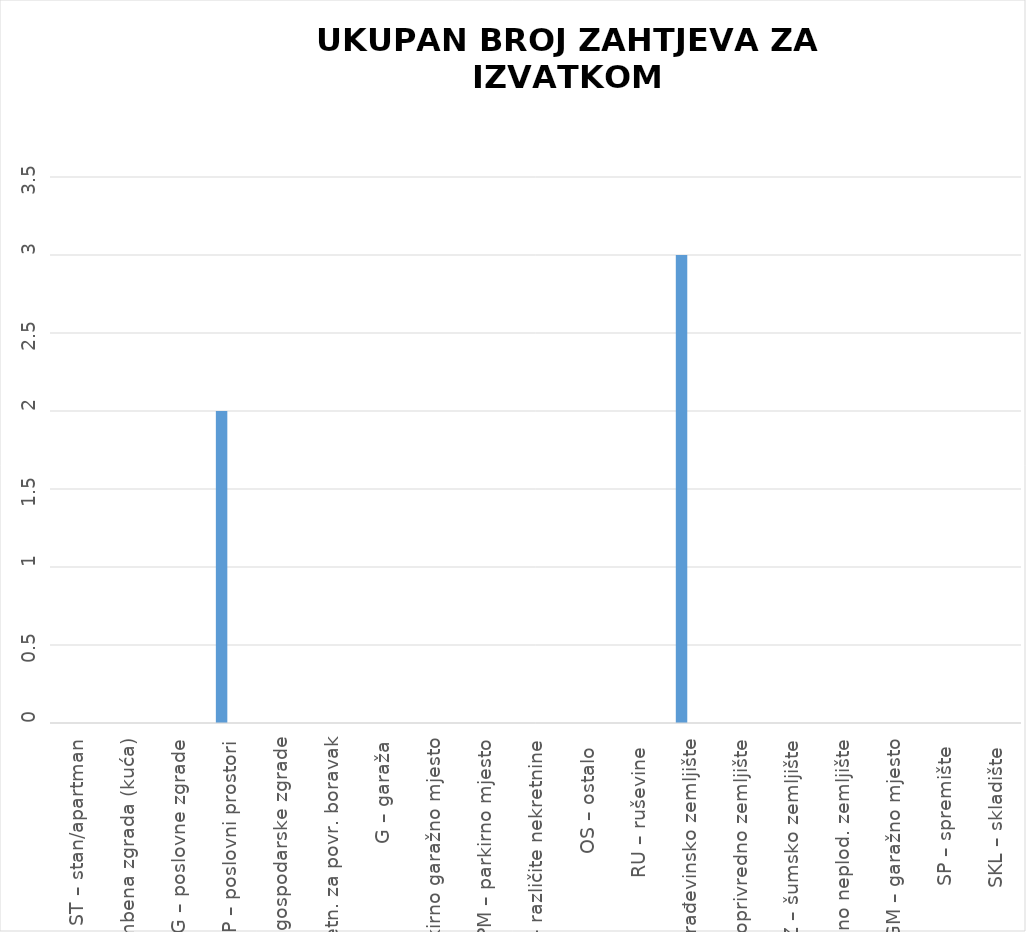
| Category | BROJ ZAPRIMLJENIH ZAHTJEVA KROZ APLIKACIJU eNekretnine | BROJ ZAPRIMLJENIH ZAHTJEVA IZVAN APLIKACIJE
(Popunjava službenik) |
|---|---|---|
| ST – stan/apartman | 0 | 0 |
| OK – stambena zgrada (kuća) | 0 | 0 |
| PZG – poslovne zgrade | 0 | 0 |
| PP – poslovni prostori | 2 | 0 |
| GZG – gospodarske zgrade | 0 | 0 |
| VIK – nekretn. za povr. boravak | 0 | 0 |
| G – garaža | 0 | 0 |
| PGM – parkirno garažno mjesto | 0 | 0 |
| VPM – parkirno mjesto | 0 | 0 |
| RN – različite nekretnine | 0 | 0 |
| OS – ostalo  | 0 | 0 |
| RU – ruševine  | 0 | 0 |
| GZ – građevinsko zemljište | 3 | 0 |
| PZ – poljoprivredno zemljište | 0 | 0 |
| ŠZ – šumsko zemljište | 0 | 0 |
| PNZ – prirodno neplod. zemljište | 0 | 0 |
| GM – garažno mjesto | 0 | 0 |
| SP – spremište  | 0 | 0 |
| SKL – skladište  | 0 | 0 |